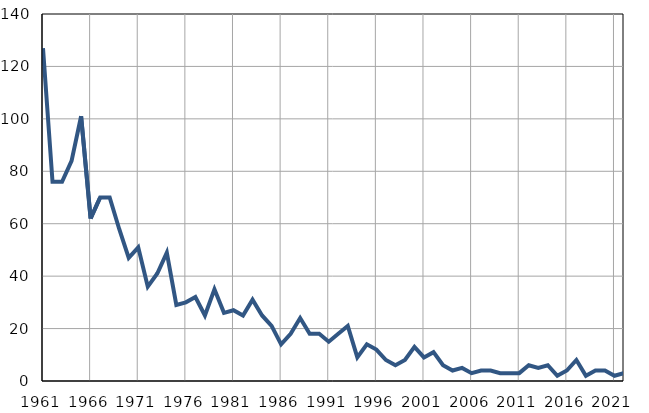
| Category | Infants
deaths |
|---|---|
| 1961.0 | 127 |
| 1962.0 | 76 |
| 1963.0 | 76 |
| 1964.0 | 84 |
| 1965.0 | 101 |
| 1966.0 | 62 |
| 1967.0 | 70 |
| 1968.0 | 70 |
| 1969.0 | 58 |
| 1970.0 | 47 |
| 1971.0 | 51 |
| 1972.0 | 36 |
| 1973.0 | 41 |
| 1974.0 | 49 |
| 1975.0 | 29 |
| 1976.0 | 30 |
| 1977.0 | 32 |
| 1978.0 | 25 |
| 1979.0 | 35 |
| 1980.0 | 26 |
| 1981.0 | 27 |
| 1982.0 | 25 |
| 1983.0 | 31 |
| 1984.0 | 25 |
| 1985.0 | 21 |
| 1986.0 | 14 |
| 1987.0 | 18 |
| 1988.0 | 24 |
| 1989.0 | 18 |
| 1990.0 | 18 |
| 1991.0 | 15 |
| 1992.0 | 18 |
| 1993.0 | 21 |
| 1994.0 | 9 |
| 1995.0 | 14 |
| 1996.0 | 12 |
| 1997.0 | 8 |
| 1998.0 | 6 |
| 1999.0 | 8 |
| 2000.0 | 13 |
| 2001.0 | 9 |
| 2002.0 | 11 |
| 2003.0 | 6 |
| 2004.0 | 4 |
| 2005.0 | 5 |
| 2006.0 | 3 |
| 2007.0 | 4 |
| 2008.0 | 4 |
| 2009.0 | 3 |
| 2010.0 | 3 |
| 2011.0 | 3 |
| 2012.0 | 6 |
| 2013.0 | 5 |
| 2014.0 | 6 |
| 2015.0 | 2 |
| 2016.0 | 4 |
| 2017.0 | 8 |
| 2018.0 | 2 |
| 2019.0 | 4 |
| 2020.0 | 4 |
| 2021.0 | 2 |
| 2022.0 | 3 |